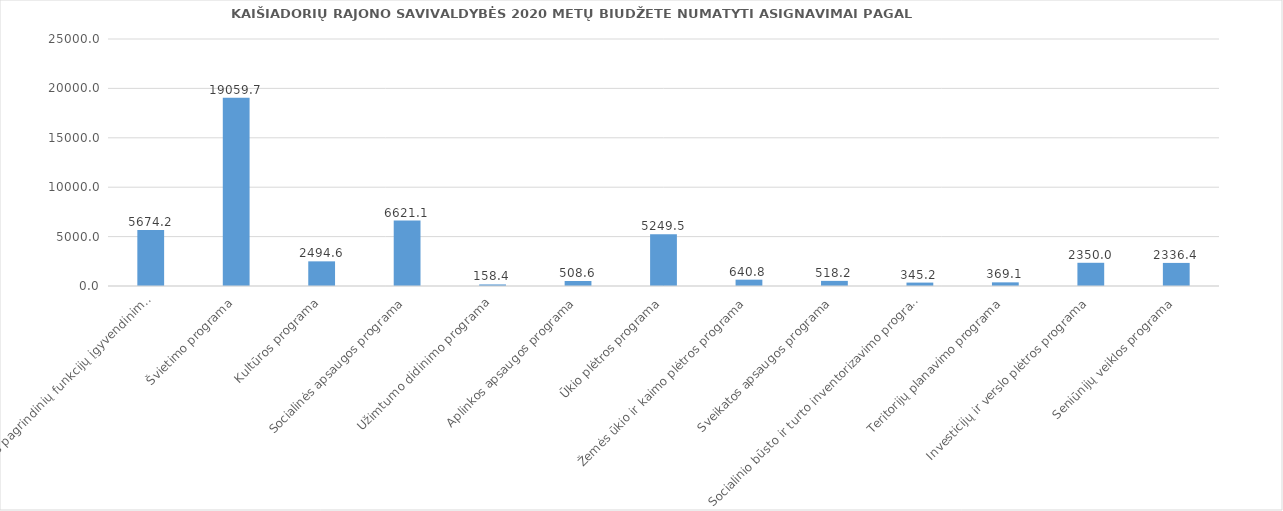
| Category | Series 0 |
|---|---|
| Savivaldybės pagrindinių funkcijų įgyvendinimo ir viešosios tvarkos užtikrinimo programa | 5674.2 |
| Švietimo programa | 19059.7 |
| Kultūros programa | 2494.6 |
| Socialinės apsaugos programa | 6621.1 |
| Užimtumo didinimo programa | 158.4 |
| Aplinkos apsaugos programa | 508.6 |
| Ūkio plėtros programa | 5249.5 |
| Žemės ūkio ir kaimo plėtros programa | 640.8 |
| Sveikatos apsaugos programa | 518.2 |
| Socialinio būsto ir turto inventorizavimo programa | 345.2 |
| Teritorijų planavimo programa | 369.1 |
| Investicijų ir verslo plėtros programa | 2350 |
| Seniūnijų veiklos programa | 2336.4 |